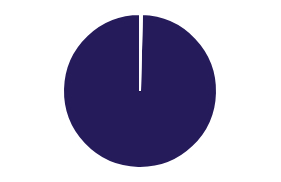
| Category | Series 0 |
|---|---|
| 0 | 0.004 |
| 1 | 0.996 |